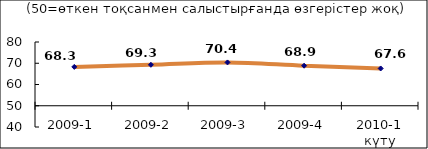
| Category | Диф.индекс ↓ |
|---|---|
| 2009-1 | 68.28 |
| 2009-2 | 69.275 |
| 2009-3 | 70.385 |
| 2009-4 | 68.85 |
| 2010-1 күту | 67.55 |